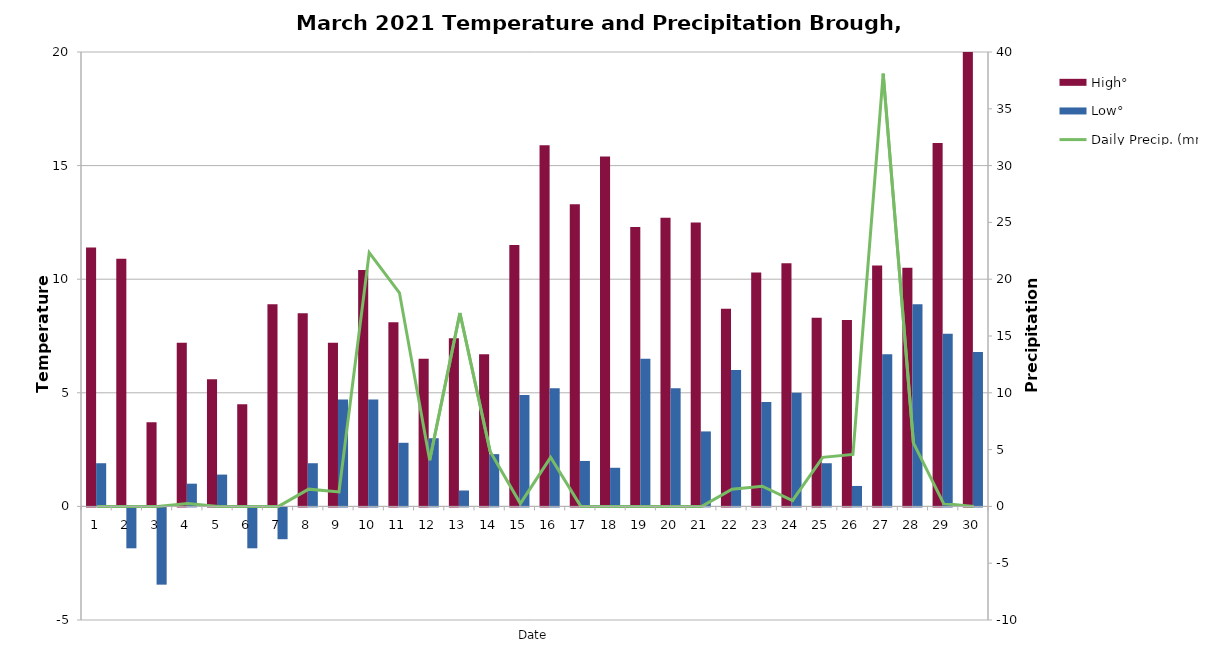
| Category | High° | Low° |
|---|---|---|
| 0 | 11.4 | 1.9 |
| 1 | 10.9 | -1.8 |
| 2 | 3.7 | -3.4 |
| 3 | 7.2 | 1 |
| 4 | 5.6 | 1.4 |
| 5 | 4.5 | -1.8 |
| 6 | 8.9 | -1.4 |
| 7 | 8.5 | 1.9 |
| 8 | 7.2 | 4.7 |
| 9 | 10.4 | 4.7 |
| 10 | 8.1 | 2.8 |
| 11 | 6.5 | 3 |
| 12 | 7.4 | 0.7 |
| 13 | 6.7 | 2.3 |
| 14 | 11.5 | 4.9 |
| 15 | 15.9 | 5.2 |
| 16 | 13.3 | 2 |
| 17 | 15.4 | 1.7 |
| 18 | 12.3 | 6.5 |
| 19 | 12.7 | 5.2 |
| 20 | 12.5 | 3.3 |
| 21 | 8.7 | 6 |
| 22 | 10.3 | 4.6 |
| 23 | 10.7 | 5 |
| 24 | 8.3 | 1.9 |
| 25 | 8.2 | 0.9 |
| 26 | 10.6 | 6.7 |
| 27 | 10.5 | 8.9 |
| 28 | 16 | 7.6 |
| 29 | 20.1 | 6.8 |